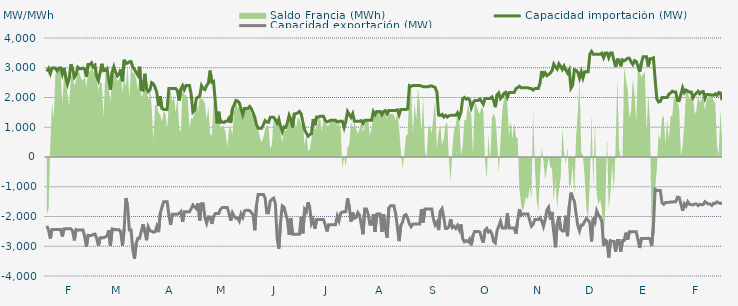
| Category | Capacidad importación (MW) | Capacidad exportación (MW) |
|---|---|---|
| 0 | 2875 | -2314.583 |
| 1900-01-01 | 2975 | -2462.5 |
| 1900-01-02 | 2802.083 | -2741.667 |
| 1900-01-03 | 2987.5 | -2433.333 |
| 1900-01-04 | 2987.5 | -2433.333 |
| 1900-01-05 | 2987.5 | -2433.333 |
| 1900-01-06 | 2893.75 | -2433.333 |
| 1900-01-07 | 2987.5 | -2433.333 |
| 1900-01-08 | 2995.833 | -2437.5 |
| 1900-01-09 | 2781.25 | -2670.833 |
| 1900-01-10 | 2993.75 | -2412.5 |
| 1900-01-11 | 2679.167 | -2412.5 |
| 1900-01-12 | 2450 | -2412.5 |
| 1900-01-13 | 2645.833 | -2412.5 |
| 1900-01-14 | 3120.833 | -2412.5 |
| 1900-01-15 | 2958.333 | -2495.833 |
| 1900-01-16 | 2681.25 | -2802.083 |
| 1900-01-17 | 2768.75 | -2439.583 |
| 1900-01-18 | 3016.667 | -2456.25 |
| 1900-01-19 | 2966.667 | -2454.167 |
| 1900-01-20 | 2966.667 | -2452.083 |
| 1900-01-21 | 2991.667 | -2454.167 |
| 1900-01-22 | 2952.083 | -2670.833 |
| 1900-01-23 | 2697.917 | -3016.667 |
| 1900-01-24 | 3108.333 | -2631.25 |
| 1900-01-25 | 3100 | -2637.5 |
| 1900-01-26 | 3166.667 | -2637.5 |
| 1900-01-27 | 3025 | -2604.167 |
| 1900-01-28 | 3083.333 | -2589.583 |
| 1900-01-29 | 2708.333 | -2743.75 |
| 1900-01-30 | 2570.833 | -2979.167 |
| 1900-01-31 | 2833.333 | -2716.667 |
| 1900-02-01 | 3133.333 | -2716.667 |
| 1900-02-02 | 2900 | -2710.417 |
| 1900-02-03 | 2904.167 | -2689.583 |
| 1900-02-04 | 2966.667 | -2654.167 |
| 1900-02-05 | 2587.5 | -2462.5 |
| 1900-02-06 | 2266.667 | -2977.083 |
| 1900-02-07 | 2845.833 | -2416.667 |
| 1900-02-08 | 3033.333 | -2429.167 |
| 1900-02-09 | 2845.833 | -2441.667 |
| 1900-02-10 | 2725 | -2441.667 |
| 1900-02-11 | 2783.333 | -2441.667 |
| 1900-02-12 | 2943.75 | -2529.167 |
| 1900-02-13 | 2545.833 | -2975 |
| 1900-02-14 | 3266.667 | -2410.417 |
| 1900-02-15 | 3137.5 | -1379.167 |
| 1900-02-16 | 3158.333 | -1654.167 |
| 1900-02-17 | 3200 | -2454.167 |
| 1900-02-18 | 3208.333 | -2456.25 |
| 1900-02-19 | 3025 | -3112.5 |
| 1900-02-20 | 2943.75 | -3418.75 |
| 1900-02-21 | 2835.417 | -2900 |
| 1900-02-22 | 2741.667 | -2729.167 |
| 1900-02-23 | 3033.333 | -2729.167 |
| 1900-02-24 | 2262.5 | -2487.5 |
| 1900-02-25 | 2245.833 | -2262.5 |
| 1900-02-26 | 2797.917 | -2500 |
| 1900-02-27 | 2295.652 | -2797.826 |
| 1900-02-28 | 2200 | -2350 |
| 1900-02-28 | 2262.5 | -2481.25 |
| 1900-03-01 | 2500 | -2491.667 |
| 1900-03-02 | 2458.333 | -2529.167 |
| 1900-03-03 | 2341.667 | -2512.5 |
| 1900-03-04 | 2162.5 | -2331.25 |
| 1900-03-05 | 1712.5 | -2525 |
| 1900-03-06 | 2043.75 | -1885.417 |
| 1900-03-07 | 1629.167 | -1687.5 |
| 1900-03-08 | 1600 | -1500 |
| 1900-03-09 | 1600 | -1500 |
| 1900-03-10 | 1600 | -1500 |
| 1900-03-11 | 2300 | -1937.5 |
| 1900-03-12 | 2300 | -2281.25 |
| 1900-03-13 | 2300 | -1920.833 |
| 1900-03-14 | 2300 | -1920.833 |
| 1900-03-15 | 2300 | -1920.833 |
| 1900-03-16 | 2225 | -1920.833 |
| 1900-03-17 | 1896.083 | -1898.167 |
| 1900-03-18 | 2287.5 | -1837.5 |
| 1900-03-19 | 2400 | -2181.25 |
| 1900-03-20 | 2266.667 | -1837.5 |
| 1900-03-21 | 2400 | -1841.667 |
| 1900-03-22 | 2400 | -1841.667 |
| 1900-03-23 | 2400 | -1841.667 |
| 1900-03-24 | 2100 | -1737.5 |
| 1900-03-25 | 1512.5 | -1612.5 |
| 1900-03-26 | 1575 | -1675 |
| 1900-03-27 | 1975 | -1737.5 |
| 1900-03-28 | 2008.333 | -1560.417 |
| 1900-03-29 | 2056.25 | -2133.333 |
| 1900-03-30 | 2400 | -1570.833 |
| 1900-03-31 | 2300 | -1570.833 |
| 1900-04-01 | 2266.667 | -2031.25 |
| 1900-04-02 | 2400 | -2225 |
| 1900-04-03 | 2487.5 | -2010.417 |
| 1900-04-04 | 2904.167 | -2016.667 |
| 1900-04-05 | 2512.5 | -2250 |
| 1900-04-06 | 2541.667 | -2000 |
| 1900-04-07 | 1884.392 | -1900 |
| 1900-04-08 | 1133.333 | -1900 |
| 1900-04-09 | 1520.875 | -1900 |
| 1900-04-10 | 1166.667 | -1758.333 |
| 1900-04-11 | 1183.333 | -1700 |
| 1900-04-12 | 1158.333 | -1700 |
| 1900-04-13 | 1200 | -1700 |
| 1900-04-14 | 1200 | -1700 |
| 1900-04-15 | 1304.583 | -1887.5 |
| 1900-04-16 | 1145.417 | -2139.583 |
| 1900-04-17 | 1629.167 | -1875 |
| 1900-04-18 | 1750 | -1987.5 |
| 1900-04-19 | 1900 | -2058.333 |
| 1900-04-20 | 1879.167 | -2050 |
| 1900-04-21 | 1820.833 | -2156.25 |
| 1900-04-22 | 1616.667 | -1912.5 |
| 1900-04-23 | 1420.833 | -2027.083 |
| 1900-04-24 | 1633.333 | -1812.5 |
| 1900-04-25 | 1625 | -1791.667 |
| 1900-04-26 | 1637.5 | -1791.667 |
| 1900-04-27 | 1700 | -1800 |
| 1900-04-28 | 1620.833 | -1868.75 |
| 1900-04-29 | 1487.5 | -1937.5 |
| 1900-04-30 | 1337.5 | -2464.583 |
| 1900-05-01 | 1083.333 | -1610.417 |
| 1900-05-02 | 966.667 | -1258.333 |
| 1900-05-03 | 966.667 | -1258.333 |
| 1900-05-04 | 966.667 | -1258.333 |
| 1900-05-05 | 1083.333 | -1258.333 |
| 1900-05-06 | 1225 | -1375 |
| 1900-05-07 | 1175 | -1875 |
| 1900-05-08 | 1166.667 | -1875 |
| 1900-05-09 | 1333.333 | -1475 |
| 1900-05-10 | 1333.333 | -1425 |
| 1900-05-11 | 1333.333 | -1383.333 |
| 1900-05-12 | 1254.167 | -1577.083 |
| 1900-05-13 | 1133.333 | -2725 |
| 1900-05-14 | 1275 | -3081.25 |
| 1900-05-15 | 1029.167 | -2189.583 |
| 1900-05-16 | 850 | -1641.667 |
| 1900-05-17 | 1008.333 | -1683.333 |
| 1900-05-18 | 991.667 | -1916.667 |
| 1900-05-19 | 1150 | -2114.583 |
| 1900-05-20 | 1400 | -2612.5 |
| 1900-05-21 | 1262.5 | -2058.333 |
| 1900-05-22 | 995.833 | -2600 |
| 1900-05-23 | 1445.833 | -2600 |
| 1900-05-24 | 1458.333 | -2600 |
| 1900-05-25 | 1483.333 | -2600 |
| 1900-05-26 | 1533.333 | -2600 |
| 1900-05-27 | 1450 | -2012.5 |
| 1900-05-28 | 1175 | -2566.667 |
| 1900-05-29 | 912.5 | -1762.5 |
| 1900-05-30 | 806.25 | -1841.667 |
| 1900-05-31 | 700 | -1520.833 |
| 1900-06-01 | 756.25 | -1710.417 |
| 1900-06-02 | 783.333 | -2239.583 |
| 1900-06-03 | 1270.833 | -2112.5 |
| 1900-06-04 | 1066.667 | -2410.417 |
| 1900-06-05 | 1345.833 | -2104.167 |
| 1900-06-06 | 1341.667 | -2104.167 |
| 1900-06-07 | 1366.667 | -2104.167 |
| 1900-06-08 | 1366.667 | -2104.167 |
| 1900-06-09 | 1366.667 | -2104.167 |
| 1900-06-10 | 1231.25 | -2275 |
| 1900-06-11 | 1181.25 | -2504.167 |
| 1900-06-12 | 1200 | -2275 |
| 1900-06-13 | 1233.333 | -2275 |
| 1900-06-14 | 1233.333 | -2275 |
| 1900-06-15 | 1233.333 | -2275 |
| 1900-06-16 | 1233.333 | -2275 |
| 1900-06-17 | 1175 | -1987.5 |
| 1900-06-18 | 1200 | -2147.917 |
| 1900-06-19 | 1200 | -1887.5 |
| 1900-06-20 | 1200 | -1850 |
| 1900-06-21 | 987.5 | -1850 |
| 1900-06-22 | 1200 | -1831.25 |
| 1900-06-23 | 1529.167 | -1387.5 |
| 1900-06-24 | 1427.083 | -1679.167 |
| 1900-06-25 | 1331.25 | -2172.917 |
| 1900-06-26 | 1456.25 | -1868.75 |
| 1900-06-27 | 1200 | -2060.417 |
| 1900-06-28 | 1200 | -2029.167 |
| 1900-06-29 | 1200 | -1868.75 |
| 1900-06-30 | 1200 | -1958.333 |
| 1900-07-01 | 1225 | -2275 |
| 1900-07-02 | 1125 | -2595.833 |
| 1900-07-03 | 1233.333 | -1750 |
| 1900-07-04 | 1233.333 | -1750 |
| 1900-07-05 | 1233.333 | -1925 |
| 1900-07-06 | 1233.333 | -2262.5 |
| 1900-07-07 | 1233.333 | -2262.5 |
| 1900-07-08 | 1525 | -1925 |
| 1900-07-09 | 1425 | -2520.833 |
| 1900-07-10 | 1533.333 | -1920.833 |
| 1900-07-11 | 1533.333 | -1908.333 |
| 1900-07-12 | 1533.333 | -1920.833 |
| 1900-07-13 | 1425 | -2520.833 |
| 1900-07-14 | 1533.333 | -1920.833 |
| 1900-07-15 | 1562.5 | -2412.5 |
| 1900-07-16 | 1454.167 | -2710.417 |
| 1900-07-17 | 1566.667 | -1712.5 |
| 1900-07-18 | 1566.667 | -1641.667 |
| 1900-07-19 | 1566.667 | -1641.667 |
| 1900-07-20 | 1566.667 | -1641.667 |
| 1900-07-21 | 1566.667 | -1904.167 |
| 1900-07-22 | 1587.5 | -2362.5 |
| 1900-07-23 | 1418.75 | -2827.083 |
| 1900-07-24 | 1595.833 | -2297.917 |
| 1900-07-25 | 1595.833 | -2193.75 |
| 1900-07-26 | 1595.833 | -1964.583 |
| 1900-07-27 | 1595.833 | -1937.5 |
| 1900-07-28 | 1618.75 | -2058.333 |
| 1900-07-29 | 2400 | -2250 |
| 1900-07-30 | 2375 | -2341.667 |
| 1900-07-31 | 2400 | -2250 |
| 1900-08-01 | 2400 | -2250 |
| 1900-08-02 | 2400 | -2250 |
| 1900-08-03 | 2400 | -2250 |
| 1900-08-04 | 2400 | -2250 |
| 1900-08-05 | 2387.5 | -1750 |
| 1900-08-06 | 2364.583 | -2208.333 |
| 1900-08-07 | 2364.583 | -1745.833 |
| 1900-08-08 | 2360.417 | -1745.833 |
| 1900-08-09 | 2358.333 | -1745.833 |
| 1900-08-10 | 2387.5 | -1745.833 |
| 1900-08-11 | 2387.5 | -1745.833 |
| 1900-08-12 | 2362.5 | -2100 |
| 1900-08-13 | 2335.417 | -2283.333 |
| 1900-08-14 | 2181.25 | -2187.5 |
| 1900-08-15 | 1408.333 | -2456.25 |
| 1900-08-16 | 1395.833 | -1820.833 |
| 1900-08-17 | 1433.333 | -1737.5 |
| 1900-08-18 | 1345.833 | -2037.5 |
| 1900-08-19 | 1400 | -2400 |
| 1900-08-20 | 1341.667 | -2400 |
| 1900-08-21 | 1383.333 | -2345.833 |
| 1900-08-22 | 1400 | -2087.5 |
| 1900-08-23 | 1400 | -2370.833 |
| 1900-08-24 | 1400 | -2327.083 |
| 1900-08-25 | 1400 | -2400 |
| 1900-08-26 | 1487.5 | -2300 |
| 1900-08-27 | 1337.5 | -2445.833 |
| 1900-08-28 | 1500 | -2266.667 |
| 1900-08-29 | 1958.333 | -2750 |
| 1900-08-30 | 2000 | -2850 |
| 1900-08-31 | 1941.667 | -2812.5 |
| 1900-09-01 | 1975 | -2850 |
| 1900-09-02 | 1920.833 | -2762.5 |
| 1900-09-03 | 1654.167 | -2968.75 |
| 1900-09-04 | 1808.333 | -2639.583 |
| 1900-09-05 | 1900 | -2500 |
| 1900-09-06 | 1900 | -2500 |
| 1900-09-07 | 1900 | -2500 |
| 1900-09-08 | 1950 | -2525 |
| 1900-09-09 | 1866.667 | -2727.083 |
| 1900-09-10 | 1775 | -2877.083 |
| 1900-09-11 | 1966.667 | -2462.5 |
| 1900-09-12 | 1966.667 | -2400 |
| 1900-09-13 | 1966.667 | -2525 |
| 1900-09-14 | 1966.667 | -2483.333 |
| 1900-09-15 | 2016.667 | -2583.333 |
| 1900-09-16 | 1900 | -2837.5 |
| 1900-09-17 | 1675 | -2887.5 |
| 1900-09-18 | 2091.667 | -2477.083 |
| 1900-09-19 | 2154.167 | -2325 |
| 1900-09-20 | 1962.5 | -2162.5 |
| 1900-09-21 | 2029.167 | -2387.5 |
| 1900-09-22 | 2137.5 | -2387.5 |
| 1900-09-23 | 2175 | -2387.5 |
| 1900-09-24 | 2010 | -1886 |
| 1900-09-25 | 2170.833 | -2383.333 |
| 1900-09-26 | 2170.833 | -2383.333 |
| 1900-09-27 | 2170.833 | -2383.333 |
| 1900-09-28 | 2170.833 | -2383.333 |
| 1900-09-29 | 2300 | -2579.167 |
| 1900-09-30 | 2331.25 | -2131.25 |
| 1900-10-01 | 2379.167 | -1758.333 |
| 1900-10-02 | 2329.167 | -1960.417 |
| 1900-10-03 | 2329.167 | -1916.667 |
| 1900-10-04 | 2329.167 | -1916.667 |
| 1900-10-05 | 2329.167 | -1916.667 |
| 1900-10-06 | 2329.167 | -1918.75 |
| 1900-10-07 | 2300 | -2131.25 |
| 1900-10-08 | 2300 | -2325 |
| 1900-10-09 | 2250 | -2256.25 |
| 1900-10-10 | 2300 | -2104.167 |
| 1900-10-11 | 2300 | -2104.167 |
| 1900-10-12 | 2300 | -2104.167 |
| 1900-10-13 | 2475 | -2043.75 |
| 1900-10-14 | 2887.5 | -2150 |
| 1900-10-15 | 2737.5 | -2335.417 |
| 1900-10-16 | 2829.167 | -2106.25 |
| 1900-10-17 | 2732.25 | -1787 |
| 1900-10-18 | 2775 | -1691.667 |
| 1900-10-19 | 2820.833 | -2106.25 |
| 1900-10-20 | 2900 | -1845.833 |
| 1900-10-21 | 3125 | -2520.833 |
| 1900-10-22 | 3025 | -3033.333 |
| 1900-10-23 | 2956.25 | -2250 |
| 1900-10-24 | 3133.333 | -1987.5 |
| 1900-10-25 | 3045.833 | -2425 |
| 1900-10-26 | 2941.667 | -2485.417 |
| 1900-10-27 | 3058.333 | -2483.333 |
| 1900-10-28 | 2925 | -1975 |
| 1900-10-29 | 2825 | -2662.5 |
| 1900-10-30 | 2933.333 | -1658.333 |
| 1900-10-31 | 2312.5 | -1195.833 |
| 1900-11-01 | 2412.5 | -1375 |
| 1900-11-02 | 2933.333 | -1483.333 |
| 1900-11-03 | 2910.417 | -1912.5 |
| 1900-11-04 | 2850 | -2300 |
| 1900-11-05 | 2650 | -2483.333 |
| 1900-11-06 | 2866.667 | -2283.333 |
| 1900-11-07 | 2658.333 | -2283.333 |
| 1900-11-08 | 2866.667 | -2162.5 |
| 1900-11-09 | 2866.667 | -2066.667 |
| 1900-11-10 | 2866.667 | -2129.167 |
| 1900-11-11 | 3456.25 | -2204.167 |
| 1900-11-12 | 3550 | -2837.5 |
| 1900-11-13 | 3454.167 | -2041.667 |
| 1900-11-14 | 3454.167 | -2179.167 |
| 1900-11-15 | 3454.167 | -1808.333 |
| 1900-11-16 | 3454.167 | -1938.75 |
| 1900-11-17 | 3454.167 | -2029.167 |
| 1900-11-18 | 3487.5 | -2175 |
| 1900-11-19 | 3337.5 | -2983.333 |
| 1900-11-20 | 3500 | -2791.667 |
| 1900-11-21 | 3500 | -2833.333 |
| 1900-11-22 | 3337.5 | -3379.167 |
| 1900-11-23 | 3500 | -2812.5 |
| 1900-11-24 | 3500 | -2833.333 |
| 1900-11-25 | 3250 | -2837.5 |
| 1900-11-26 | 3028.25 | -3181.25 |
| 1900-11-27 | 3266.667 | -2808.333 |
| 1900-11-28 | 3266.667 | -2808.333 |
| 1900-11-29 | 3050 | -3181.25 |
| 1900-11-30 | 3266.667 | -2808.333 |
| 1900-12-01 | 3233.333 | -2808.333 |
| 1900-12-02 | 3275 | -2543.75 |
| 1900-12-03 | 3320.833 | -2779.167 |
| 1900-12-04 | 3320.833 | -2516.667 |
| 1900-12-05 | 3195.833 | -2516.667 |
| 1900-12-06 | 3108.333 | -2516.667 |
| 1900-12-07 | 3241.667 | -2516.667 |
| 1900-12-08 | 3212.5 | -2516.667 |
| 1900-12-09 | 3054.167 | -2775 |
| 1900-12-10 | 2862.5 | -3058.333 |
| 1900-12-11 | 3162.5 | -2741.667 |
| 1900-12-12 | 3366.667 | -2741.667 |
| 1900-12-13 | 3366.667 | -2741.667 |
| 1900-12-14 | 3366.667 | -2741.667 |
| 1900-12-15 | 3041.667 | -2729.167 |
| 1900-12-16 | 3306.25 | -2750 |
| 1900-12-17 | 3306.25 | -2991.667 |
| 1900-12-18 | 3333.333 | -2337.5 |
| 1900-12-19 | 2602.083 | -1083.333 |
| 1900-12-20 | 1950 | -1125 |
| 1900-12-21 | 1850 | -1125 |
| 1900-12-22 | 1866.667 | -1125 |
| 1900-12-23 | 2000 | -1537.5 |
| 1900-12-24 | 2000 | -1587.5 |
| 1900-12-25 | 2000 | -1529.167 |
| 1900-12-26 | 2000 | -1529.167 |
| 1900-12-27 | 2114.583 | -1525 |
| 1900-12-28 | 2154.167 | -1512.5 |
| 1900-12-29 | 2210.417 | -1516.667 |
| 1900-12-30 | 2183.333 | -1500 |
| 1900-12-31 | 2185.417 | -1500 |
| 1901-01-01 | 1906.25 | -1350 |
| 1901-01-02 | 1893.75 | -1358.333 |
| 1901-01-03 | 2104.167 | -1579.167 |
| 1901-01-04 | 2328.375 | -1804.167 |
| 1901-01-05 | 2166.667 | -1572.917 |
| 1901-01-06 | 2250 | -1650 |
| 1901-01-07 | 2212.5 | -1502.083 |
| 1901-01-08 | 2179.167 | -1589.583 |
| 1901-01-09 | 2187.5 | -1600 |
| 1901-01-10 | 1987.5 | -1612.5 |
| 1901-01-11 | 2091.667 | -1581.25 |
| 1901-01-12 | 2147.917 | -1581.25 |
| 1901-01-13 | 2208.333 | -1635.417 |
| 1901-01-14 | 2127.083 | -1589.583 |
| 1901-01-15 | 2185.417 | -1604.167 |
| 1901-01-16 | 2200 | -1597.917 |
| 1901-01-17 | 1966.667 | -1500 |
| 1901-01-18 | 2104.167 | -1545.833 |
| 1901-01-19 | 2102.083 | -1583.333 |
| 1901-01-20 | 2089.583 | -1581.25 |
| 1901-01-21 | 2085.417 | -1627.083 |
| 1901-01-22 | 2075 | -1554.167 |
| 1901-01-23 | 2122.917 | -1562.5 |
| 1901-01-24 | 2072.917 | -1508.333 |
| 1901-01-25 | 2166.667 | -1539.583 |
| 1901-01-26 | 2152.083 | -1560.417 |
| 1901-01-27 | 1908.333 | -1531.25 |